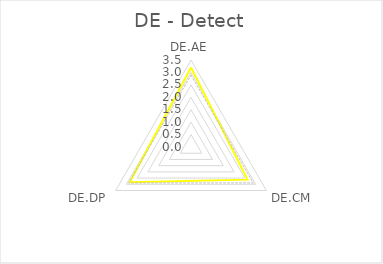
| Category | Series 0 | Series 1 |
|---|---|---|
| DE.AE | 3.2 | 2.889 |
| DE.CM | 2.625 | 2.889 |
| DE.DP | 2.841 | 2.889 |